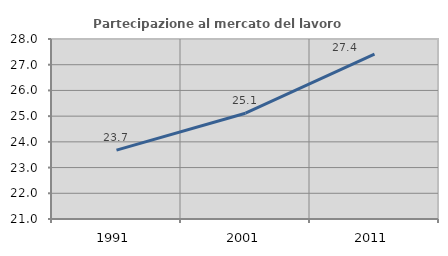
| Category | Partecipazione al mercato del lavoro  femminile |
|---|---|
| 1991.0 | 23.677 |
| 2001.0 | 25.113 |
| 2011.0 | 27.41 |